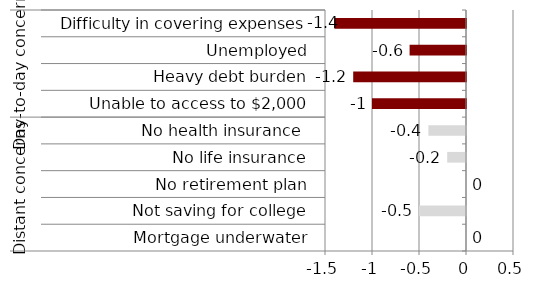
| Category | Series 0 |
|---|---|
| 0 | 0 |
| 1 | -0.5 |
| 2 | 0 |
| 3 | -0.2 |
| 4 | -0.4 |
| 5 | -1 |
| 6 | -1.2 |
| 7 | -0.6 |
| 8 | -1.4 |